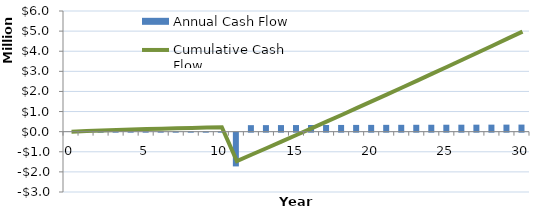
| Category | Annual Cash Flow |
|---|---|
| 0.0 | 0 |
| 1.0 | 28341.772 |
| 2.0 | 26978.461 |
| 3.0 | 25577.258 |
| 4.0 | 24137.113 |
| 5.0 | 22657.265 |
| 6.0 | 21136.938 |
| 7.0 | 19575.344 |
| 8.0 | 17971.681 |
| 9.0 | 16325.132 |
| 10.0 | 14634.867 |
| 11.0 | -1678045.364 |
| 12.0 | 323805.801 |
| 13.0 | 325635.011 |
| 14.0 | 327440.84 |
| 15.0 | 329221.809 |
| 16.0 | 330976.388 |
| 17.0 | 332702.992 |
| 18.0 | 334399.982 |
| 19.0 | 336065.663 |
| 20.0 | 337698.278 |
| 21.0 | 339296.012 |
| 22.0 | 340856.986 |
| 23.0 | 342379.257 |
| 24.0 | 343860.813 |
| 25.0 | 345299.578 |
| 26.0 | 346693.401 |
| 27.0 | 348040.059 |
| 28.0 | 349337.254 |
| 29.0 | 350582.611 |
| 30.0 | 351773.674 |